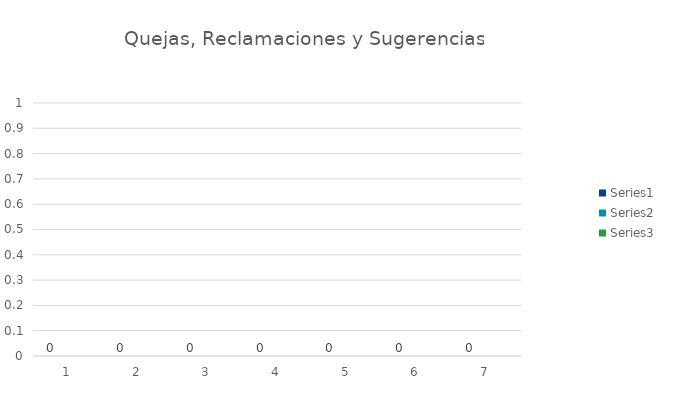
| Category | Series 0 | Series 1 | Series 2 |
|---|---|---|---|
| 0 | 0 | 0 | 0 |
| 1 | 0 | 0 | 0 |
| 2 | 0 | 0 | 0 |
| 3 | 0 | 0 | 0 |
| 4 | 0 | 0 | 0 |
| 5 | 0 | 0 | 0 |
| 6 | 0 | 0 | 0 |